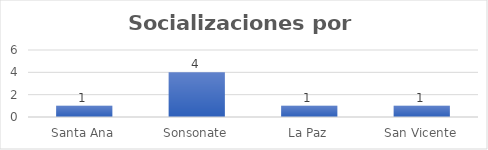
| Category | Socializaciones |
|---|---|
| Santa Ana | 1 |
| Sonsonate | 4 |
| La Paz | 1 |
| San Vicente | 1 |